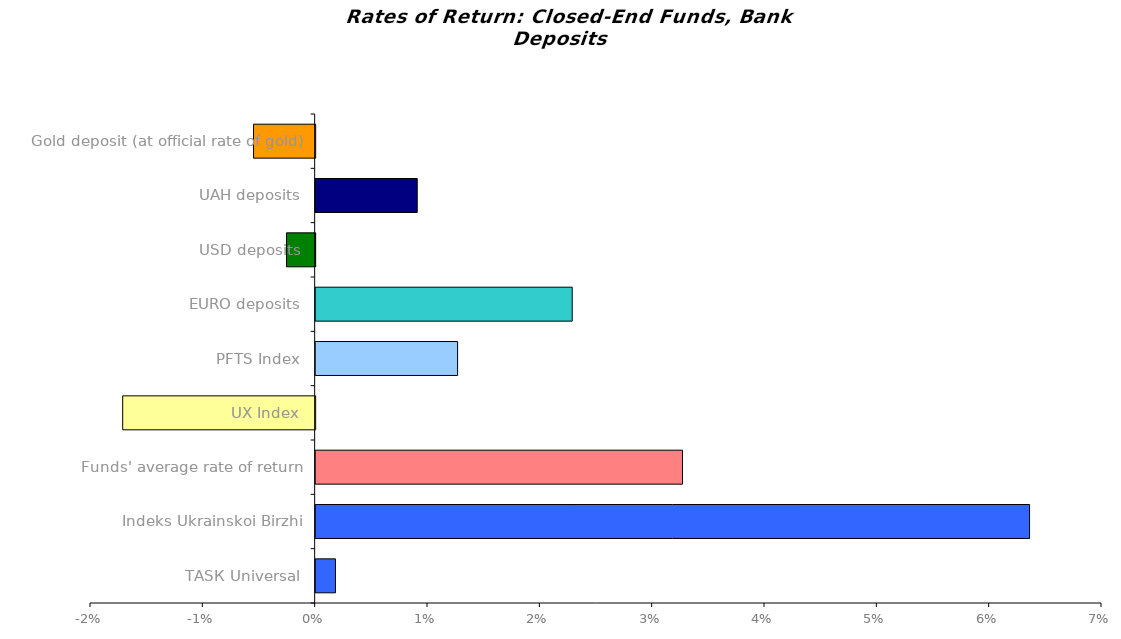
| Category | Series 0 |
|---|---|
| ТАSК Universal | 0.002 |
| Indeks Ukrainskoi Birzhi | 0.064 |
| Funds' average rate of return | 0.033 |
| UX Index | -0.017 |
| PFTS Index | 0.013 |
| EURO deposits | 0.023 |
| USD deposits | -0.003 |
| UAH deposits | 0.009 |
| Gold deposit (at official rate of gold) | -0.005 |